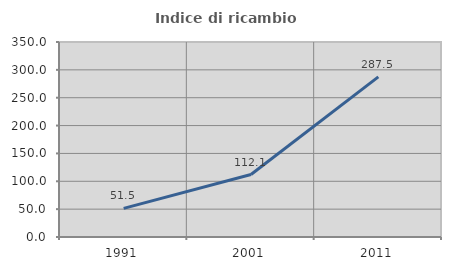
| Category | Indice di ricambio occupazionale  |
|---|---|
| 1991.0 | 51.456 |
| 2001.0 | 112.069 |
| 2011.0 | 287.5 |